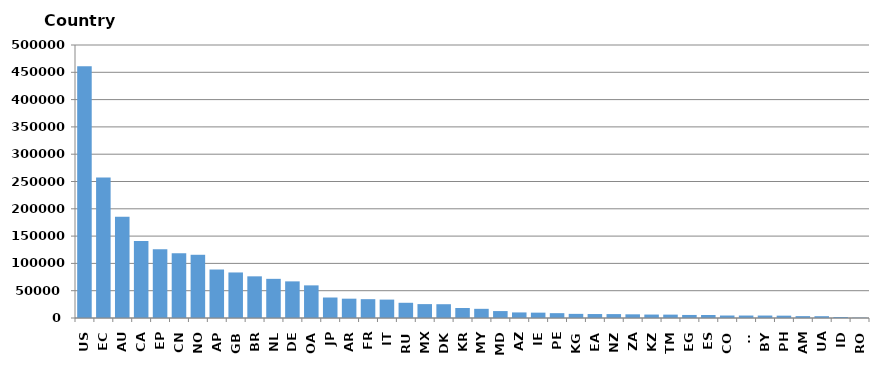
| Category | Series 0 |
|---|---|
| US | 461240 |
| EC | 257507 |
| AU | 185636 |
| CA | 141047 |
| EP | 126053 |
| CN | 118752 |
| NO | 115782 |
| AP | 88793 |
| GB | 83395 |
| BR | 76309 |
| NL | 71723 |
| DE | 67087 |
| OA | 59769 |
| JP | 37521 |
| AR | 35386 |
| FR | 34478 |
| IT | 33704 |
| RU | 27880 |
| MX | 25441 |
| DK | 25248 |
| KR | 18339 |
| MY | 16808 |
| MD | 12697 |
| AZ | 10212 |
| IE | 9800 |
| PE | 8875 |
| KG | 7570 |
| EA | 7257 |
| NZ | 7150 |
| ZA | 6745 |
| KZ | 6314 |
| TM | 6189 |
| EG | 5582 |
| ES | 5462 |
| CO | 4554 |
| TJ | 4516 |
| BY | 4510 |
| PH | 4283 |
| AM | 3447 |
| UA | 3316 |
| ID | 1849 |
| RO | 582 |